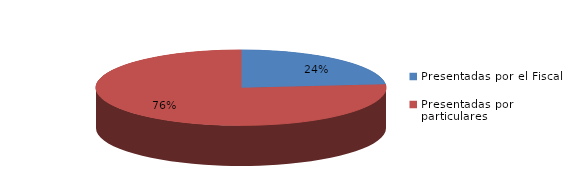
| Category | Series 0 |
|---|---|
| Presentadas por el Fiscal | 48 |
| Presentadas por particulares | 156 |